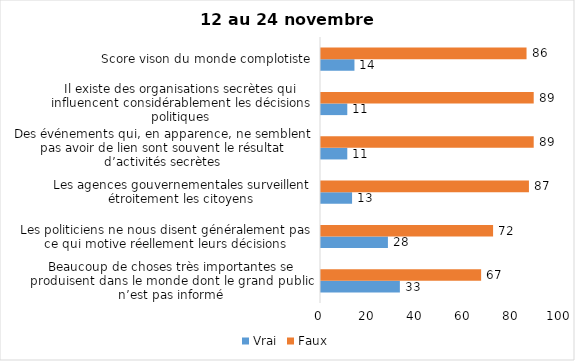
| Category | Vrai | Faux |
|---|---|---|
| Beaucoup de choses très importantes se produisent dans le monde dont le grand public n’est pas informé | 33 | 67 |
| Les politiciens ne nous disent généralement pas ce qui motive réellement leurs décisions | 28 | 72 |
| Les agences gouvernementales surveillent étroitement les citoyens | 13 | 87 |
| Des événements qui, en apparence, ne semblent pas avoir de lien sont souvent le résultat d’activités secrètes | 11 | 89 |
| Il existe des organisations secrètes qui influencent considérablement les décisions politiques | 11 | 89 |
| Score vison du monde complotiste | 14 | 86 |